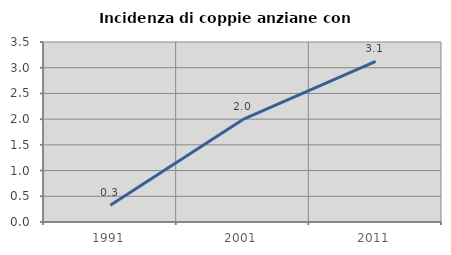
| Category | Incidenza di coppie anziane con figli |
|---|---|
| 1991.0 | 0.326 |
| 2001.0 | 1.993 |
| 2011.0 | 3.125 |